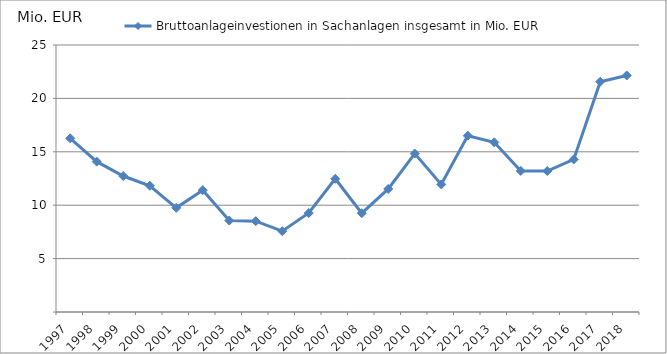
| Category | Bruttoanlageinvestionen in Sachanlagen insgesamt in Mio. EUR |
|---|---|
| 1997.0 | 16.261 |
| 1998.0 | 14.078 |
| 1999.0 | 12.731 |
| 2000.0 | 11.822 |
| 2001.0 | 9.752 |
| 2002.0 | 11.408 |
| 2003.0 | 8.567 |
| 2004.0 | 8.502 |
| 2005.0 | 7.569 |
| 2006.0 | 9.268 |
| 2007.0 | 12.474 |
| 2008.0 | 9.251 |
| 2009.0 | 11.52 |
| 2010.0 | 14.838 |
| 2011.0 | 11.944 |
| 2012.0 | 16.506 |
| 2013.0 | 15.886 |
| 2014.0 | 13.207 |
| 2015.0 | 13.201 |
| 2016.0 | 14.285 |
| 2017.0 | 21.561 |
| 2018.0 | 22.148 |